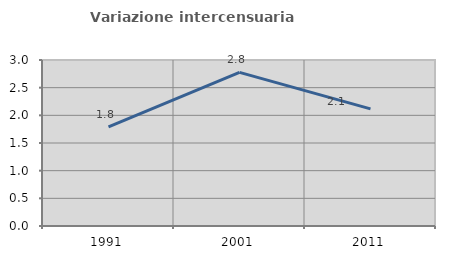
| Category | Variazione intercensuaria annua |
|---|---|
| 1991.0 | 1.792 |
| 2001.0 | 2.776 |
| 2011.0 | 2.118 |